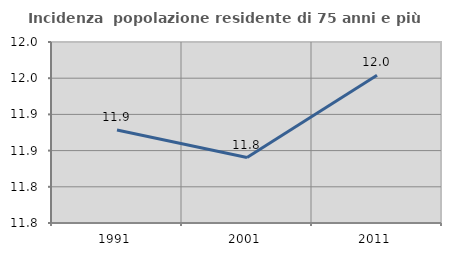
| Category | Incidenza  popolazione residente di 75 anni e più |
|---|---|
| 1991.0 | 11.878 |
| 2001.0 | 11.84 |
| 2011.0 | 11.954 |